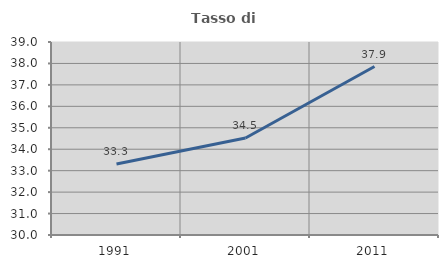
| Category | Tasso di occupazione   |
|---|---|
| 1991.0 | 33.308 |
| 2001.0 | 34.522 |
| 2011.0 | 37.856 |